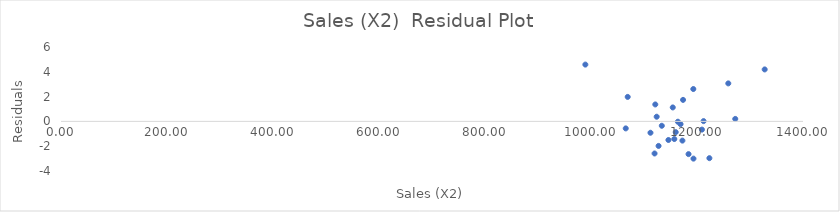
| Category | Series 0 |
|---|---|
| 1157.2 | -1.422 |
| 1133.6 | -0.353 |
| 989.35 | 4.582 |
| 1163.92 | -0.026 |
| 1272.17 | 0.2 |
| 1123.91 | 0.377 |
| 1327.71 | 4.192 |
| 1193.05 | 2.61 |
| 1127.48 | -1.978 |
| 1159.85 | -0.868 |
| 1193.35 | -3.003 |
| 1069.25 | 1.975 |
| 1173.67 | 1.735 |
| 1112.23 | -0.916 |
| 1119.94 | -2.587 |
| 1212.42 | 0.023 |
| 1146.08 | -1.499 |
| 1259.05 | 3.065 |
| 1223.37 | -2.965 |
| 1209.33 | -0.662 |
| 1065.54 | -0.565 |
| 1154.27 | 1.126 |
| 1168.96 | -0.222 |
| 1172.48 | -1.549 |
| 1121.31 | 1.367 |
| 1184.05 | -2.638 |